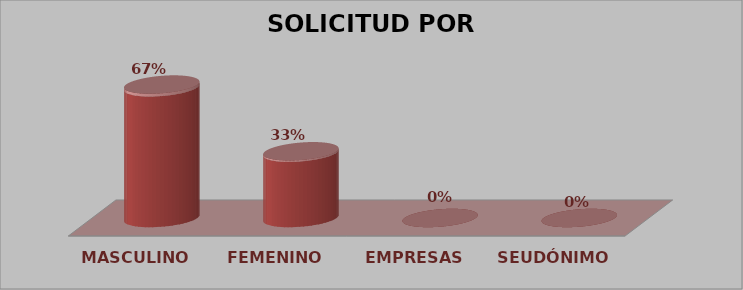
| Category | SOLICITUD POR GÉNERO | Series 1 |
|---|---|---|
| MASCULINO | 32 | 0.667 |
| FEMENINO | 16 | 0.333 |
| EMPRESAS | 0 | 0 |
| SEUDÓNIMO | 0 | 0 |